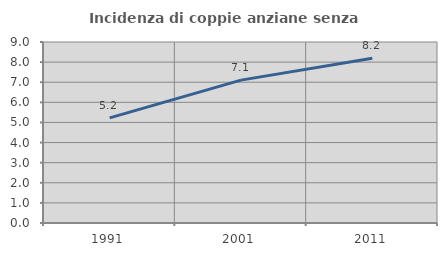
| Category | Incidenza di coppie anziane senza figli  |
|---|---|
| 1991.0 | 5.227 |
| 2001.0 | 7.104 |
| 2011.0 | 8.191 |